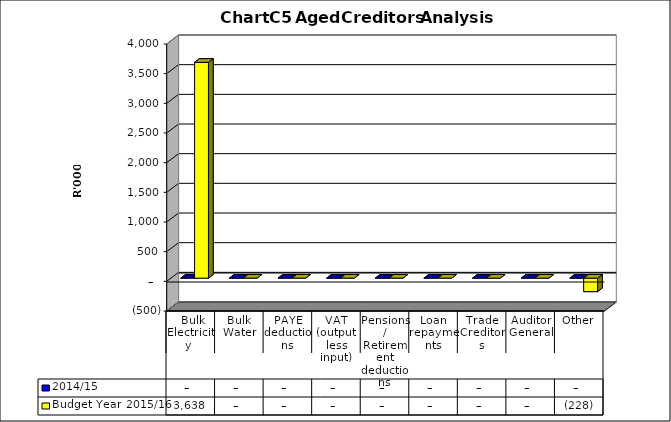
| Category | 2014/15 | Budget Year 2015/16 |
|---|---|---|
|  Bulk Electricity  | 0 | 3637659 |
| Bulk Water | 0 | 0 |
| PAYE deductions | 0 | 0 |
| VAT (output less input) | 0 | 0 |
| Pensions / Retirement deductions | 0 | 0 |
| Loan repayments | 0 | 0 |
| Trade Creditors | 0 | 0 |
| Auditor General | 0 | 0 |
| Other | 0 | -227707 |